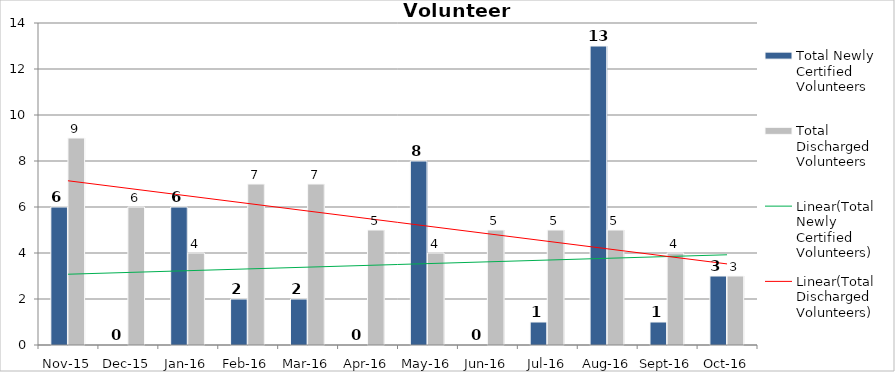
| Category | Total Newly Certified Volunteers | Total Discharged Volunteers |
|---|---|---|
| Nov-15 | 6 | 9 |
| Dec-15 | 0 | 6 |
| Jan-16 | 6 | 4 |
| Feb-16 | 2 | 7 |
| Mar-16 | 2 | 7 |
| Apr-16 | 0 | 5 |
| May-16 | 8 | 4 |
| Jun-16 | 0 | 5 |
| Jul-16 | 1 | 5 |
| Aug-16 | 13 | 5 |
| Sep-16 | 1 | 4 |
| Oct-16 | 3 | 3 |